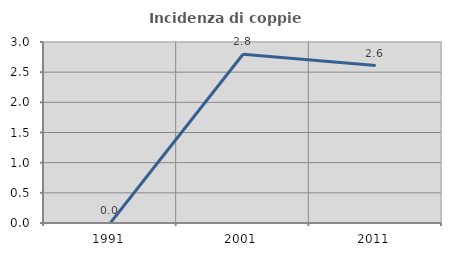
| Category | Incidenza di coppie miste |
|---|---|
| 1991.0 | 0 |
| 2001.0 | 2.797 |
| 2011.0 | 2.609 |